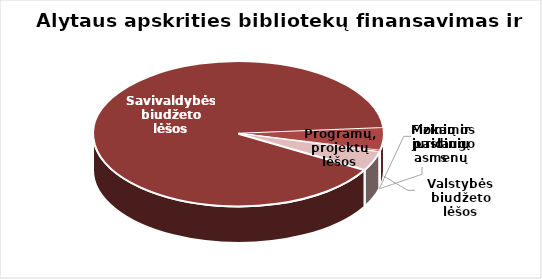
| Category | Series 0 |
|---|---|
| Savivaldybės biudžeto lėšos | 2986718.59 |
| Valstybės biudžeto lėšos | 164124 |
| Mokamos paslaugos | 11928.5 |
| Fizinių ir juridinių asmenų parama | 920.05 |
| Programų, projektų lėšos | 139084.94 |